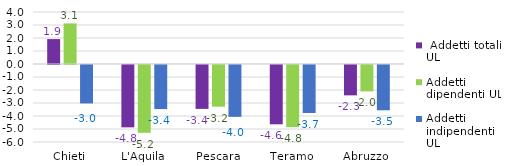
| Category |  Addetti totali UL | Addetti dipendenti UL | Addetti indipendenti UL |
|---|---|---|---|
| Chieti | 1.916 | 3.122 | -2.956 |
| L'Aquila | -4.795 | -5.207 | -3.392 |
| Pescara | -3.377 | -3.205 | -3.985 |
| Teramo | -4.561 | -4.779 | -3.691 |
| Abruzzo | -2.335 | -2.03 | -3.483 |